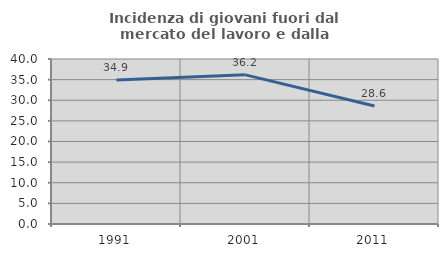
| Category | Incidenza di giovani fuori dal mercato del lavoro e dalla formazione  |
|---|---|
| 1991.0 | 34.924 |
| 2001.0 | 36.158 |
| 2011.0 | 28.622 |